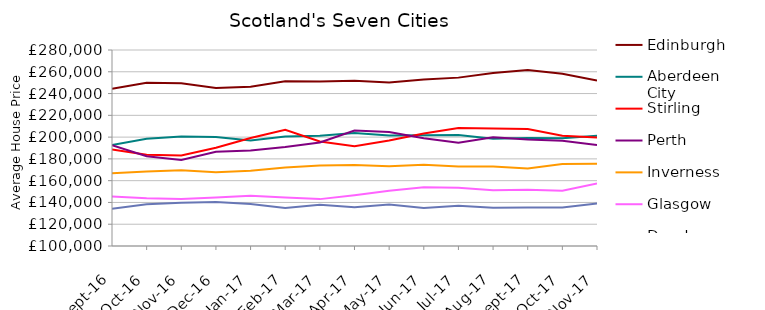
| Category | Edinburgh | Aberdeen City | Stirling | Perth | Inverness | Glasgow | Dundee |
|---|---|---|---|---|---|---|---|
| 2016-09-01 | 244324.923 | 192854.056 | 188554.282 | 192571.111 | 166755.674 | 145358.628 | 134175.074 |
| 2016-10-01 | 249958.835 | 198591.453 | 183789.014 | 182494.45 | 168436.4 | 143813.817 | 138425.951 |
| 2016-11-01 | 249505.232 | 200482.911 | 183043.154 | 178964.816 | 169589.028 | 143114.505 | 139704.078 |
| 2016-12-01 | 245016.338 | 200116.545 | 190266.247 | 186592.232 | 167790.284 | 144491.784 | 140452.202 |
| 2017-01-01 | 246360.248 | 196818.122 | 199234.61 | 187721.392 | 169059.34 | 146182.915 | 138551.515 |
| 2017-02-01 | 251208.018 | 200603.565 | 206816.02 | 191012.25 | 172172.29 | 144538.35 | 134929.289 |
| 2017-03-01 | 251094.268 | 201340.731 | 195964.332 | 195028.287 | 174030.345 | 143053.029 | 137853.937 |
| 2017-04-01 | 251672.465 | 203764.382 | 191718.598 | 205992.038 | 174337.48 | 146672.417 | 135655.199 |
| 2017-05-01 | 250070.681 | 201394.819 | 196878.36 | 204768.431 | 173127.089 | 150685.377 | 138027.182 |
| 2017-06-01 | 252959.403 | 201634.247 | 203380.683 | 198992.095 | 174689.78 | 153941.217 | 134934.82 |
| 2017-07-01 | 254629.931 | 201984.092 | 208257.93 | 194758.807 | 173085.417 | 153479.195 | 136929.571 |
| 2017-08-01 | 258903.946 | 198449.952 | 207817.872 | 199906.863 | 172917.654 | 151294.8 | 135106.211 |
| 2017-09-01 | 261608.411 | 199227.13 | 207476.737 | 197773.699 | 171230.959 | 151620.739 | 135315.971 |
| 2017-10-01 | 258248.817 | 198970.585 | 201204.949 | 196696.394 | 175226.832 | 150826.625 | 135455.055 |
| 2017-11-01 | 251895.298 | 201335.078 | 199570.092 | 192787.003 | 175477.22 | 157352.964 | 139107.182 |